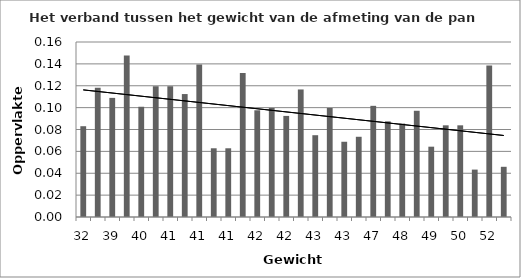
| Category | Series 0 |
|---|---|
| 32.0 | 0.083 |
| 39.0 | 0.118 |
| 39.0 | 0.109 |
| 39.0 | 0.148 |
| 40.0 | 0.101 |
| 41.0 | 0.12 |
| 41.0 | 0.12 |
| 41.0 | 0.112 |
| 41.0 | 0.139 |
| 41.0 | 0.063 |
| 41.0 | 0.063 |
| 42.0 | 0.132 |
| 42.0 | 0.098 |
| 42.0 | 0.1 |
| 42.0 | 0.092 |
| 42.0 | 0.117 |
| 43.0 | 0.075 |
| 43.0 | 0.1 |
| 43.0 | 0.069 |
| 45.0 | 0.073 |
| 47.0 | 0.102 |
| 47.0 | 0.087 |
| 48.0 | 0.085 |
| 48.0 | 0.097 |
| 49.0 | 0.064 |
| 50.0 | 0.084 |
| 50.0 | 0.084 |
| 51.0 | 0.043 |
| 52.0 | 0.139 |
| 72.0 | 0.046 |